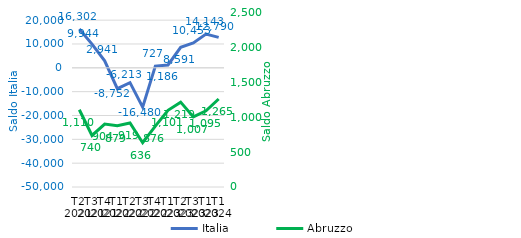
| Category | Italia |
|---|---|
| T2
2021 | 16302.301 |
| T3
2021 | 9944.364 |
| T4
2021 | 2941.39 |
| T1
2022 | -8752.198 |
| T2
2022 | -6213.22 |
| T3
2022 | -16479.746 |
| T4
2022 | 726.664 |
| T1
2023 | 1186.372 |
| T2
2023 | 8590.582 |
| T3
2023 | 10452.987 |
| T1
2023 | 14143.032 |
| T1
2024 | 12790.37 |